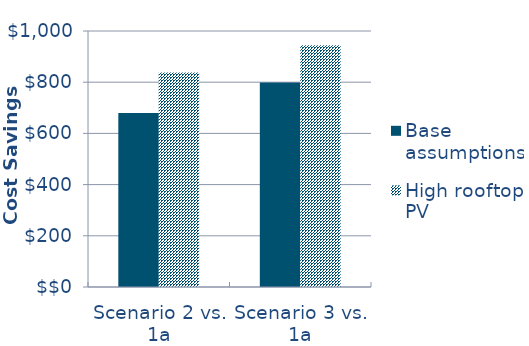
| Category | Base assumptions  | High rooftop PV |
|---|---|---|
| Scenario 2 vs. 1a | -679.806 | -838.146 |
| Scenario 3 vs. 1a | -799.049 | -944.243 |